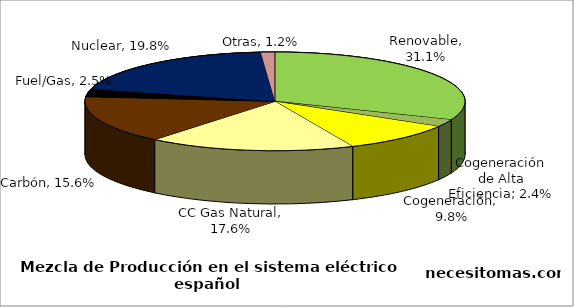
| Category | Series 0 |
|---|---|
| Renovable | 0.311 |
| Cogeneración de Alta Eficiencia | 0.024 |
| Cogeneración | 0.098 |
| CC Gas Natural | 0.176 |
| Carbón | 0.156 |
| Fuel/Gas | 0.025 |
| Nuclear | 0.198 |
| Otras | 0.012 |